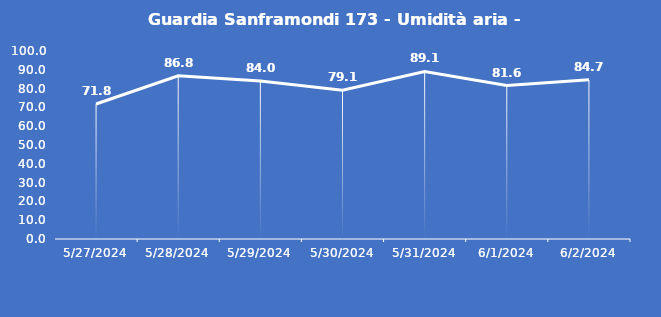
| Category | Guardia Sanframondi 173 - Umidità aria - Grezzo (%) |
|---|---|
| 5/27/24 | 71.8 |
| 5/28/24 | 86.8 |
| 5/29/24 | 84 |
| 5/30/24 | 79.1 |
| 5/31/24 | 89.1 |
| 6/1/24 | 81.6 |
| 6/2/24 | 84.7 |